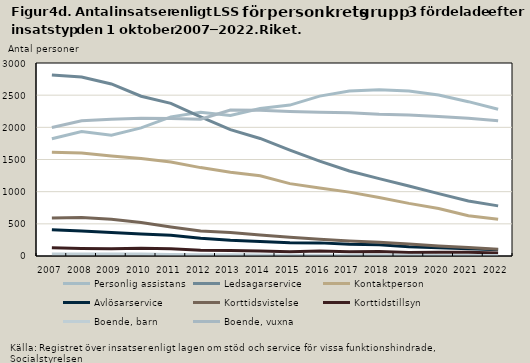
| Category | Personlig assistans | Ledsagarservice | Kontaktperson | Avlösarservice | Korttidsvistelse | Korttidstillsyn | Boende, barn | Boende, vuxna |
|---|---|---|---|---|---|---|---|---|
| 2007.0 | 1823 | 2814 | 1612 | 409 | 589 | 129 | 32 | 1997 |
| 2008.0 | 1936 | 2782 | 1601 | 387 | 599 | 116 | 31 | 2101 |
| 2009.0 | 1879 | 2674 | 1554 | 365 | 570 | 112 | 30 | 2126 |
| 2010.0 | 1991 | 2484 | 1515 | 343 | 519 | 122 | 30 | 2142 |
| 2011.0 | 2163 | 2372 | 1462 | 323 | 452 | 111 | 25 | 2139 |
| 2012.0 | 2233 | 2164 | 1374 | 275 | 390 | 90 | 20 | 2126 |
| 2013.0 | 2184 | 1965 | 1302 | 243 | 366 | 84 | 18 | 2268 |
| 2014.0 | 2293 | 1827 | 1246 | 224 | 325 | 76 | 15 | 2267 |
| 2015.0 | 2346 | 1647 | 1125 | 206 | 290 | 65 | 12 | 2245 |
| 2016.0 | 2485 | 1475 | 1057 | 204 | 259 | 78 | 11 | 2233 |
| 2017.0 | 2563 | 1321 | 993 | 181 | 233 | 65 | 13 | 2228 |
| 2018.0 | 2586 | 1203 | 910 | 173 | 213 | 69 | 11 | 2202 |
| 2019.0 | 2565 | 1087 | 818 | 143 | 185 | 55 | 10 | 2190 |
| 2020.0 | 2503 | 969 | 739 | 128 | 156 | 60 | 7 | 2168 |
| 2021.0 | 2399 | 856 | 626 | 111 | 134 | 60 | 8 | 2143 |
| 2022.0 | 2281 | 779 | 570 | 99 | 104 | 45 | 9 | 2101 |